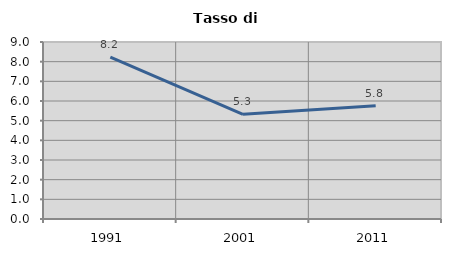
| Category | Tasso di disoccupazione   |
|---|---|
| 1991.0 | 8.235 |
| 2001.0 | 5.325 |
| 2011.0 | 5.759 |